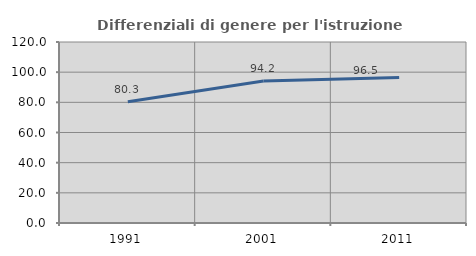
| Category | Differenziali di genere per l'istruzione superiore |
|---|---|
| 1991.0 | 80.335 |
| 2001.0 | 94.154 |
| 2011.0 | 96.504 |